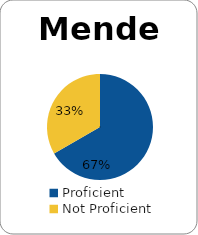
| Category | Series 0 |
|---|---|
| Proficient | 0.667 |
| Not Proficient | 0.333 |